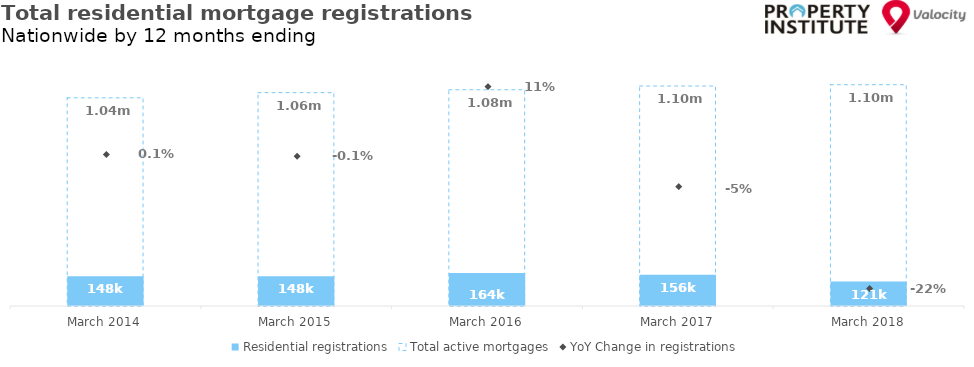
| Category | Residential registrations | Total active mortgages |
|---|---|---|
| 2014-03-01 | 147864 | 1036750 |
| 2015-03-01 | 147645 | 1062278 |
| 2016-03-01 | 164484 | 1076795 |
| 2017-03-01 | 155960 | 1095415 |
| 2018-03-01 | 121487 | 1101883 |